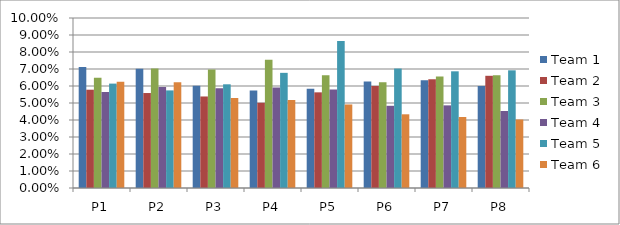
| Category | Team 1 | Team 2 | Team 3 | Team 4 | Team 5 | Team 6 |
|---|---|---|---|---|---|---|
| P1 | 0.071 | 0.058 | 0.065 | 0.056 | 0.061 | 0.063 |
| P2 | 0.07 | 0.056 | 0.07 | 0.059 | 0.057 | 0.062 |
| P3 | 0.06 | 0.054 | 0.07 | 0.059 | 0.061 | 0.053 |
| P4 | 0.057 | 0.05 | 0.075 | 0.059 | 0.068 | 0.052 |
| P5 | 0.058 | 0.056 | 0.066 | 0.058 | 0.086 | 0.049 |
| P6 | 0.063 | 0.06 | 0.062 | 0.048 | 0.07 | 0.043 |
| P7 | 0.063 | 0.064 | 0.066 | 0.049 | 0.069 | 0.042 |
| P8 | 0.06 | 0.066 | 0.066 | 0.045 | 0.069 | 0.04 |